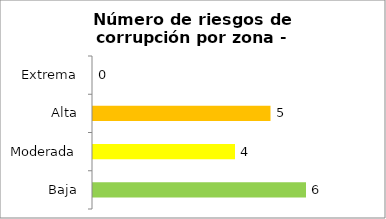
| Category | Series 0 |
|---|---|
| Baja | 6 |
| Moderada | 4 |
| Alta | 5 |
| Extrema | 0 |